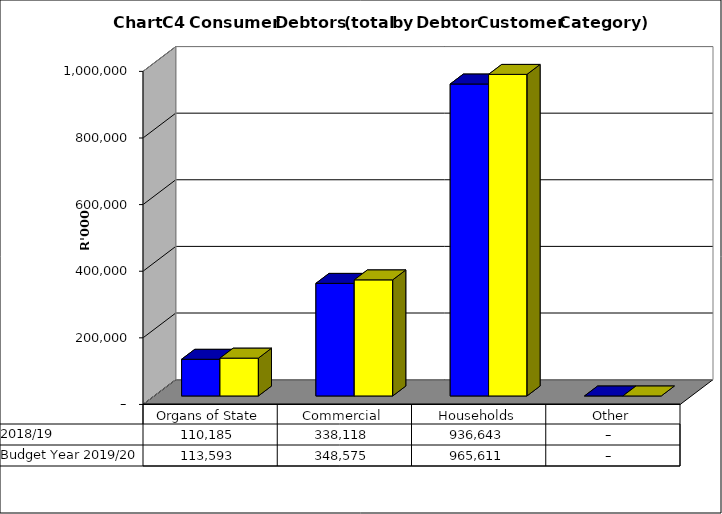
| Category |  2018/19  | Budget Year 2019/20 |
|---|---|---|
| Organs of State | 110185066.44 | 113592852 |
| Commercial | 338118118.6 | 348575380 |
| Households | 936642856.24 | 965611192 |
| Other | 0 | 0 |